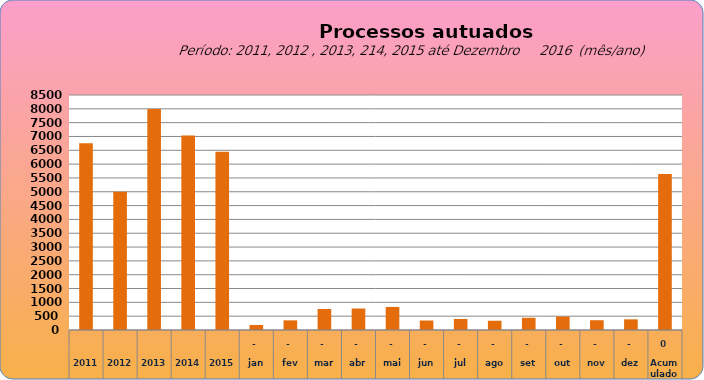
| Category | 6755 |
|---|---|
| 2011 | 6755 |
| 2012 | 4997 |
| 2013 | 7990 |
| 2014 | 7034 |
| 2015 | 6446 |
| jan | 182 |
| fev | 349 |
| mar | 760 |
| abr | 777 |
| mai | 834 |
| jun | 343 |
| jul | 397 |
| ago | 335 |
| set | 441 |
| out | 486 |
| nov | 354 |
| dez | 386 |
| Acumulado
 | 5644 |